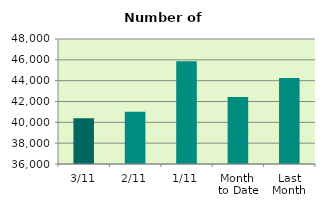
| Category | Series 0 |
|---|---|
| 3/11 | 40396 |
| 2/11 | 41024 |
| 1/11 | 45876 |
| Month 
to Date | 42432 |
| Last
Month | 44266.476 |